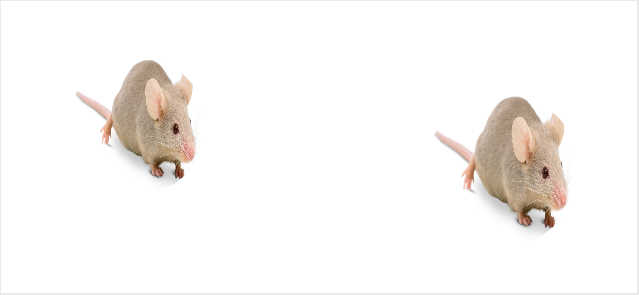
| Category | Series 0 |
|---|---|
| 3.0 | 7 |
| 12.0 | 5 |
| -50.0 | -50 |